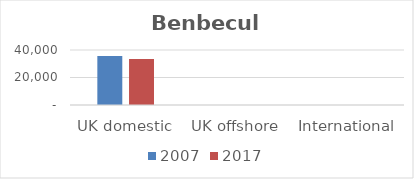
| Category | 2007 | 2017 |
|---|---|---|
| UK domestic | 35660 | 33470 |
| UK offshore | 0 | 0 |
| International | 0 | 0 |